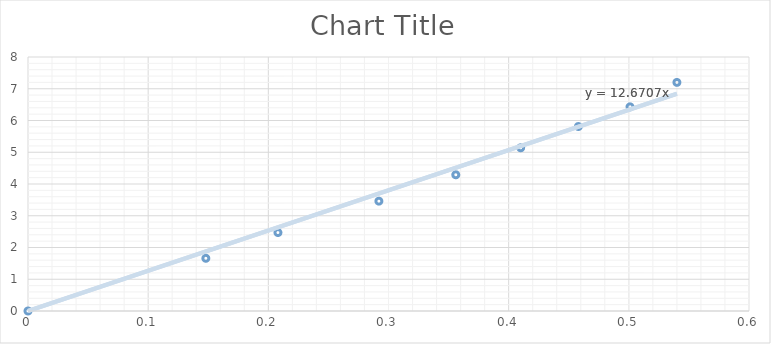
| Category | Series 0 |
|---|---|
| 0.0 | 0 |
| 0.148 | 1.66 |
| 0.208 | 2.47 |
| 0.292 | 3.46 |
| 0.356 | 4.29 |
| 0.41 | 5.14 |
| 0.458 | 5.81 |
| 0.501 | 6.43 |
| 0.54 | 7.2 |